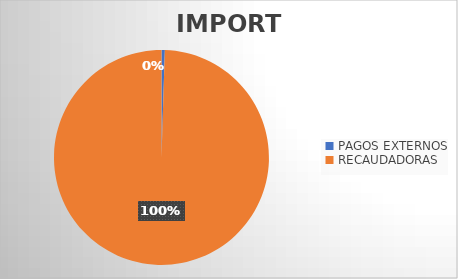
| Category | IMPORTE |
|---|---|
| PAGOS EXTERNOS | 3119317.83 |
| RECAUDADORAS | 625409915.5 |